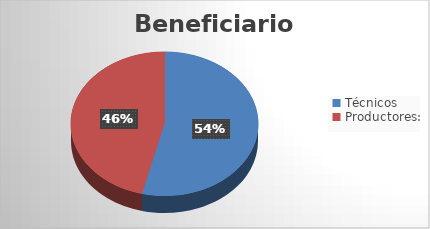
| Category | Series 0 |
|---|---|
| Técnicos | 14 |
| Productores: | 12 |